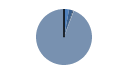
| Category | Series 0 |
|---|---|
| ARRASTRE | 78 |
| CERCO | 58 |
| PALANGRE | 14 |
| REDES DE ENMALLE | 4 |
| ARTES FIJAS | 1 |
| ARTES MENORES | 2537 |
| SIN TIPO ASIGNADO | 0 |